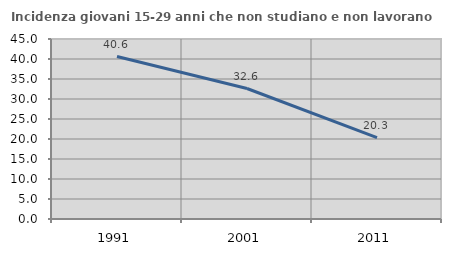
| Category | Incidenza giovani 15-29 anni che non studiano e non lavorano  |
|---|---|
| 1991.0 | 40.625 |
| 2001.0 | 32.622 |
| 2011.0 | 20.339 |